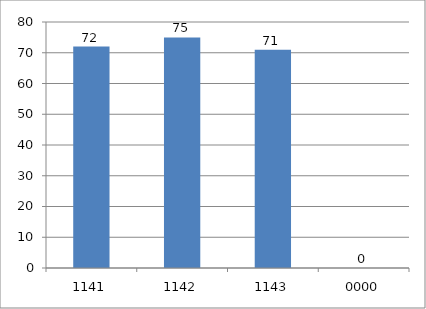
| Category | Series 0 |
|---|---|
| 1141.0 | 72 |
| 1142.0 | 75 |
| 1143.0 | 71 |
| 0.0 | 0 |